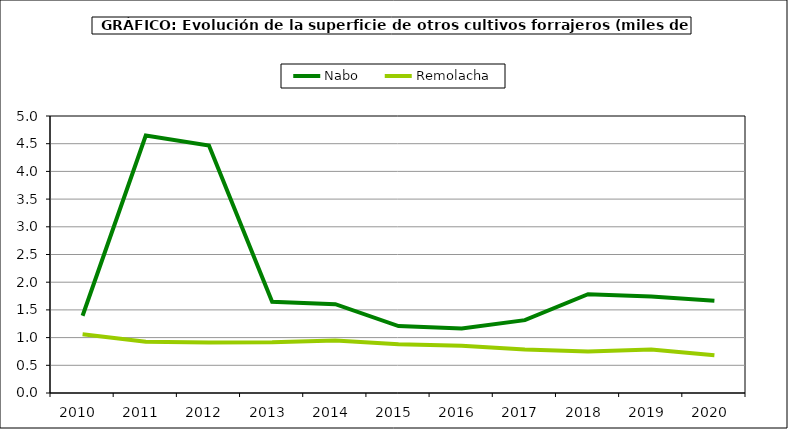
| Category | Nabo | Remolacha |
|---|---|---|
| 2010.0 | 1.395 | 1.06 |
| 2011.0 | 4.647 | 0.925 |
| 2012.0 | 4.467 | 0.913 |
| 2013.0 | 1.647 | 0.917 |
| 2014.0 | 1.603 | 0.949 |
| 2015.0 | 1.208 | 0.881 |
| 2016.0 | 1.165 | 0.854 |
| 2017.0 | 1.315 | 0.786 |
| 2018.0 | 1.784 | 0.748 |
| 2019.0 | 1.744 | 0.787 |
| 2020.0 | 1.663 | 0.681 |